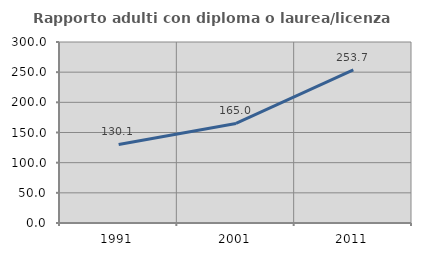
| Category | Rapporto adulti con diploma o laurea/licenza media  |
|---|---|
| 1991.0 | 130.149 |
| 2001.0 | 164.984 |
| 2011.0 | 253.748 |